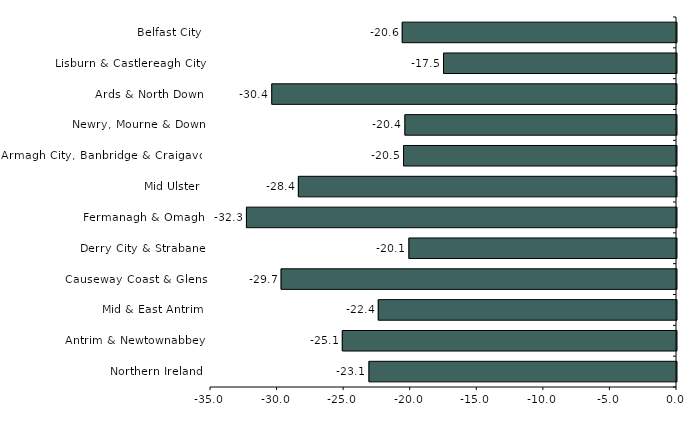
| Category | Series 0 |
|---|---|
| Belfast City | -20.6 |
| Lisburn & Castlereagh City | -17.5 |
| Ards & North Down | -30.4 |
| Newry, Mourne & Down | -20.4 |
| Armagh City, Banbridge & Craigavon | -20.5 |
| Mid Ulster | -28.4 |
| Fermanagh & Omagh | -32.3 |
| Derry City & Strabane | -20.1 |
| Causeway Coast & Glens | -29.7 |
| Mid & East Antrim | -22.4 |
| Antrim & Newtownabbey | -25.1 |
| Northern Ireland | -23.1 |